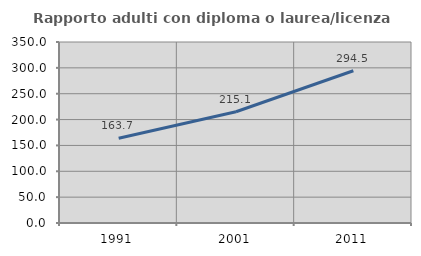
| Category | Rapporto adulti con diploma o laurea/licenza media  |
|---|---|
| 1991.0 | 163.731 |
| 2001.0 | 215.078 |
| 2011.0 | 294.458 |